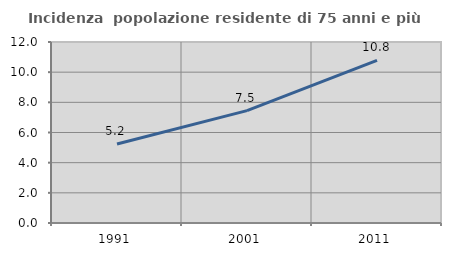
| Category | Incidenza  popolazione residente di 75 anni e più |
|---|---|
| 1991.0 | 5.241 |
| 2001.0 | 7.453 |
| 2011.0 | 10.779 |